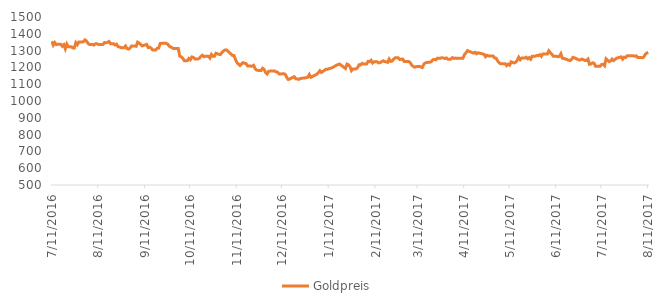
| Category | Goldpreis |
|---|---|
| 7/11/16 | 1355.25 |
| 7/12/16 | 1332.5 |
| 7/13/16 | 1347.5 |
| 7/14/16 | 1335.1 |
| 7/15/16 | 1337.85 |
| 7/17/16 | 1337.85 |
| 7/18/16 | 1326 |
| 7/19/16 | 1334.8 |
| 7/20/16 | 1310.5 |
| 7/21/16 | 1339 |
| 7/22/16 | 1323.18 |
| 7/24/16 | 1323.18 |
| 7/25/16 | 1315.7 |
| 7/26/16 | 1316 |
| 7/27/16 | 1347.5 |
| 7/28/16 | 1335.5 |
| 7/29/16 | 1351.1 |
| 7/31/16 | 1351.1 |
| 8/1/16 | 1352.78 |
| 8/2/16 | 1363.68 |
| 8/3/16 | 1357.9 |
| 8/4/16 | 1343.5 |
| 8/5/16 | 1336.6 |
| 8/7/16 | 1336.6 |
| 8/8/16 | 1333 |
| 8/9/16 | 1340.7 |
| 8/10/16 | 1340.5 |
| 8/11/16 | 1337 |
| 8/12/16 | 1336.2 |
| 8/14/16 | 1336.2 |
| 8/15/16 | 1348.1 |
| 8/16/16 | 1346.55 |
| 8/17/16 | 1348.75 |
| 8/18/16 | 1354.2 |
| 8/19/16 | 1341.5 |
| 8/21/16 | 1341.5 |
| 8/22/16 | 1333.75 |
| 8/23/16 | 1338.1 |
| 8/24/16 | 1323.75 |
| 8/25/16 | 1321.7 |
| 8/26/16 | 1317.25 |
| 8/28/16 | 1317.25 |
| 8/29/16 | 1327.2 |
| 8/30/16 | 1311.15 |
| 8/31/16 | 1308.95 |
| 9/1/16 | 1315.25 |
| 9/2/16 | 1327.75 |
| 9/4/16 | 1327.75 |
| 9/5/16 | 1325.55 |
| 9/6/16 | 1350.3 |
| 9/7/16 | 1344.95 |
| 9/8/16 | 1337.75 |
| 9/9/16 | 1328.05 |
| 9/12/16 | 1337.1 |
| 9/13/16 | 1318.5 |
| 9/14/16 | 1320.3 |
| 9/15/16 | 1314.8 |
| 9/16/16 | 1303.55 |
| 9/18/16 | 1303.55 |
| 9/19/16 | 1314.2 |
| 9/20/16 | 1315.1 |
| 9/21/16 | 1342.2 |
| 9/22/16 | 1343.2 |
| 9/23/16 | 1343.2 |
| 9/25/16 | 1343.2 |
| 9/26/16 | 1337.95 |
| 9/27/16 | 1326.4 |
| 9/28/16 | 1321.95 |
| 9/29/16 | 1315.8 |
| 9/30/16 | 1312 |
| 10/2/16 | 1312 |
| 10/3/16 | 1311.88 |
| 10/4/16 | 1266.25 |
| 10/5/16 | 1263 |
| 10/6/16 | 1254.7 |
| 10/7/16 | 1240.25 |
| 10/9/16 | 1240.25 |
| 10/10/16 | 1253.1 |
| 10/11/16 | 1245.25 |
| 10/12/16 | 1262.35 |
| 10/13/16 | 1260.25 |
| 10/14/16 | 1250.55 |
| 10/16/16 | 1250.55 |
| 10/17/16 | 1254 |
| 10/18/16 | 1265.25 |
| 10/19/16 | 1272.25 |
| 10/20/16 | 1263.63 |
| 10/21/16 | 1266.75 |
| 10/23/16 | 1266.75 |
| 10/24/16 | 1255.55 |
| 10/25/16 | 1276.75 |
| 10/26/16 | 1265.75 |
| 10/27/16 | 1265.75 |
| 10/28/16 | 1284.25 |
| 10/30/16 | 1277.7 |
| 10/31/16 | 1276.7 |
| 11/1/16 | 1289.05 |
| 11/2/16 | 1298.1 |
| 11/3/16 | 1303.05 |
| 11/4/16 | 1304.25 |
| 11/7/16 | 1279.25 |
| 11/8/16 | 1271.25 |
| 11/9/16 | 1270.55 |
| 11/10/16 | 1246.95 |
| 11/11/16 | 1227.6 |
| 11/13/16 | 1211.25 |
| 11/14/16 | 1221.1 |
| 11/15/16 | 1228.7 |
| 11/16/16 | 1224.15 |
| 11/17/16 | 1222.78 |
| 11/18/16 | 1208.55 |
| 11/21/16 | 1207.25 |
| 11/22/16 | 1212.3 |
| 11/23/16 | 1193.38 |
| 11/24/16 | 1184.08 |
| 11/25/16 | 1182.25 |
| 11/27/16 | 1182.25 |
| 11/28/16 | 1194.75 |
| 11/29/16 | 1187.75 |
| 11/30/16 | 1168.55 |
| 12/1/16 | 1161 |
| 12/2/16 | 1177.5 |
| 12/5/16 | 1178.85 |
| 12/6/16 | 1178.75 |
| 12/7/16 | 1173.95 |
| 12/8/16 | 1170.75 |
| 12/9/16 | 1160.35 |
| 12/12/16 | 1162.45 |
| 12/13/16 | 1158.25 |
| 12/14/16 | 1140.25 |
| 12/15/16 | 1128.2 |
| 12/16/16 | 1131.25 |
| 12/19/16 | 1144.75 |
| 12/20/16 | 1132.05 |
| 12/21/16 | 1131.25 |
| 12/22/16 | 1128.78 |
| 12/23/16 | 1133.95 |
| 12/27/16 | 1138.85 |
| 12/28/16 | 1141.58 |
| 12/29/16 | 1157.9 |
| 12/30/16 | 1141.25 |
| 1/3/17 | 1158.98 |
| 1/4/17 | 1168.88 |
| 1/5/17 | 1179.88 |
| 1/6/17 | 1169.75 |
| 1/9/17 | 1188.75 |
| 1/10/17 | 1189.25 |
| 1/13/17 | 1197.45 |
| 1/16/17 | 1212.75 |
| 1/17/17 | 1216.85 |
| 1/18/17 | 1220.08 |
| 1/19/17 | 1213.75 |
| 1/22/17 | 1193.35 |
| 1/23/17 | 1219.45 |
| 1/24/17 | 1215.35 |
| 1/25/17 | 1203.75 |
| 1/26/17 | 1180.63 |
| 1/27/17 | 1191.18 |
| 1/29/17 | 1191.18 |
| 1/30/17 | 1197.75 |
| 1/31/17 | 1215.35 |
| 2/1/17 | 1214.75 |
| 2/2/17 | 1224.05 |
| 2/3/17 | 1220.2 |
| 2/5/17 | 1220.2 |
| 2/6/17 | 1235.83 |
| 2/7/17 | 1233.75 |
| 2/8/17 | 1242.38 |
| 2/9/17 | 1226.33 |
| 2/10/17 | 1233.58 |
| 2/12/17 | 1233.58 |
| 2/13/17 | 1226.95 |
| 2/14/17 | 1228.68 |
| 2/16/17 | 1239.35 |
| 2/17/17 | 1235.03 |
| 2/19/17 | 1230.25 |
| 2/20/17 | 1249.75 |
| 2/21/17 | 1235.95 |
| 2/22/17 | 1237.6 |
| 2/23/17 | 1249.3 |
| 2/24/17 | 1256.98 |
| 2/26/17 | 1256.98 |
| 2/27/17 | 1247.25 |
| 2/28/17 | 1248.38 |
| 3/1/17 | 1249.75 |
| 3/2/17 | 1234.65 |
| 3/3/17 | 1234.78 |
| 3/5/17 | 1234.78 |
| 3/6/17 | 1228.05 |
| 3/7/17 | 1212.95 |
| 3/8/17 | 1205.25 |
| 3/9/17 | 1200.9 |
| 3/10/17 | 1204.8 |
| 3/12/17 | 1206.35 |
| 3/13/17 | 1202.63 |
| 3/14/17 | 1199.03 |
| 3/15/17 | 1218.88 |
| 3/16/17 | 1227.08 |
| 3/17/17 | 1229.15 |
| 3/19/17 | 1230.83 |
| 3/20/17 | 1234.38 |
| 3/21/17 | 1245.88 |
| 3/22/17 | 1247.48 |
| 3/23/17 | 1244.88 |
| 3/24/17 | 1254.98 |
| 3/26/17 | 1254.98 |
| 3/27/17 | 1257.45 |
| 3/28/17 | 1256.15 |
| 3/29/17 | 1252.45 |
| 3/30/17 | 1256.25 |
| 3/31/17 | 1249.13 |
| 4/2/17 | 1249.13 |
| 4/3/17 | 1258.25 |
| 4/4/17 | 1253.75 |
| 4/5/17 | 1255.3 |
| 4/6/17 | 1253.55 |
| 4/7/17 | 1254.05 |
| 4/8/17 | 1254.05 |
| 4/9/17 | 1254.05 |
| 4/10/17 | 1254.73 |
| 4/11/17 | 1276.75 |
| 4/12/17 | 1286.6 |
| 4/13/17 | 1299.75 |
| 4/17/17 | 1284.8 |
| 4/18/17 | 1289.65 |
| 4/19/17 | 1281.4 |
| 4/20/17 | 1286.75 |
| 4/21/17 | 1285 |
| 4/24/17 | 1278 |
| 4/25/17 | 1263.75 |
| 4/26/17 | 1272.25 |
| 4/27/17 | 1268.25 |
| 4/28/17 | 1268.15 |
| 4/30/17 | 1268.15 |
| 5/1/17 | 1256.8 |
| 5/2/17 | 1254.6 |
| 5/3/17 | 1238.38 |
| 5/4/17 | 1227.75 |
| 5/5/17 | 1221.2 |
| 5/8/17 | 1222.3 |
| 5/9/17 | 1210.7 |
| 5/10/17 | 1219.15 |
| 5/11/17 | 1213.05 |
| 5/12/17 | 1233.25 |
| 5/14/17 | 1226.25 |
| 5/15/17 | 1230.73 |
| 5/16/17 | 1241.75 |
| 5/17/17 | 1260.73 |
| 5/18/17 | 1245.95 |
| 5/19/17 | 1255.55 |
| 5/21/17 | 1255.55 |
| 5/22/17 | 1260.45 |
| 5/23/17 | 1251.15 |
| 5/24/17 | 1258.2 |
| 5/25/17 | 1249 |
| 5/26/17 | 1267.05 |
| 5/28/17 | 1267.05 |
| 5/29/17 | 1271.45 |
| 5/30/17 | 1269.5 |
| 5/31/17 | 1275.5 |
| 6/1/17 | 1265.65 |
| 6/2/17 | 1279.98 |
| 6/5/17 | 1279.95 |
| 6/6/17 | 1298.75 |
| 6/7/17 | 1286.93 |
| 6/8/17 | 1278.65 |
| 6/9/17 | 1266.4 |
| 6/11/17 | 1266.4 |
| 6/12/17 | 1263.25 |
| 6/13/17 | 1265.85 |
| 6/14/17 | 1281.45 |
| 6/15/17 | 1254 |
| 6/16/17 | 1253.63 |
| 6/19/17 | 1243.25 |
| 6/20/17 | 1240.25 |
| 6/21/17 | 1246.55 |
| 6/22/17 | 1259.93 |
| 6/23/17 | 1256.9 |
| 6/26/17 | 1244.45 |
| 6/27/17 | 1244.75 |
| 6/28/17 | 1249.33 |
| 6/29/17 | 1245.73 |
| 6/30/17 | 1241.6 |
| 7/1/17 | 1241.6 |
| 7/2/17 | 1249.8 |
| 7/3/17 | 1218.15 |
| 7/4/17 | 1220.4 |
| 7/5/17 | 1226.95 |
| 7/6/17 | 1225.15 |
| 7/7/17 | 1207.25 |
| 7/9/17 | 1207.25 |
| 7/10/17 | 1206.35 |
| 7/11/17 | 1217.7 |
| 7/12/17 | 1218.75 |
| 7/13/17 | 1209.45 |
| 7/14/17 | 1250.88 |
| 7/16/17 | 1234.75 |
| 7/17/17 | 1237.75 |
| 7/18/17 | 1249.75 |
| 7/19/17 | 1240.88 |
| 7/20/17 | 1247.75 |
| 7/21/17 | 1254.9 |
| 7/24/17 | 1262.75 |
| 7/25/17 | 1249.05 |
| 7/26/17 | 1261.1 |
| 7/27/17 | 1259 |
| 7/28/17 | 1269.25 |
| 7/31/17 | 1269.55 |
| 8/1/17 | 1269.05 |
| 8/2/17 | 1266.7 |
| 8/3/17 | 1268.65 |
| 8/4/17 | 1258.6 |
| 8/6/17 | 1258.6 |
| 8/7/17 | 1257.7 |
| 8/8/17 | 1261.5 |
| 8/9/17 | 1277.58 |
| 8/10/17 | 1285.2 |
| 8/11/17 | 1289.2 |